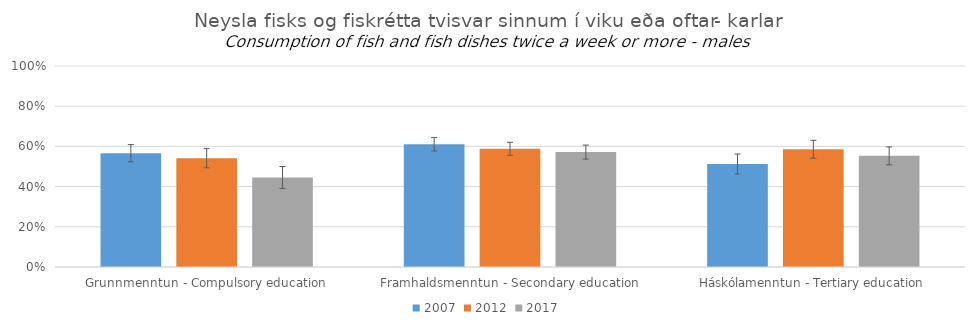
| Category | 2007 | 2012 | 2017 |
|---|---|---|---|
| Grunnmenntun - Compulsory education | 0.566 | 0.541 | 0.446 |
| Framhaldsmenntun - Secondary education | 0.611 | 0.588 | 0.572 |
| Háskólamenntun - Tertiary education | 0.513 | 0.586 | 0.553 |